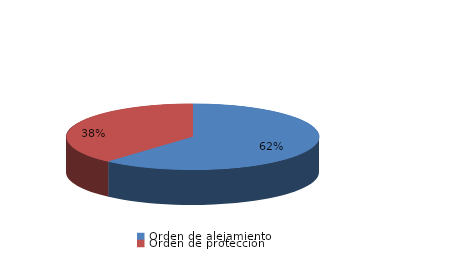
| Category | Series 0 |
|---|---|
| Orden de alejamiento | 8 |
| Orden de protección | 5 |